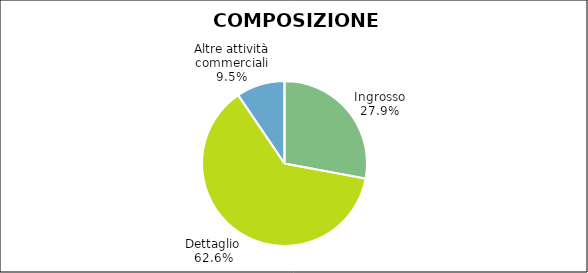
| Category | Series 0 |
|---|---|
| Ingrosso | 3092 |
| Dettaglio | 6929 |
| Altre attività commerciali | 1049 |